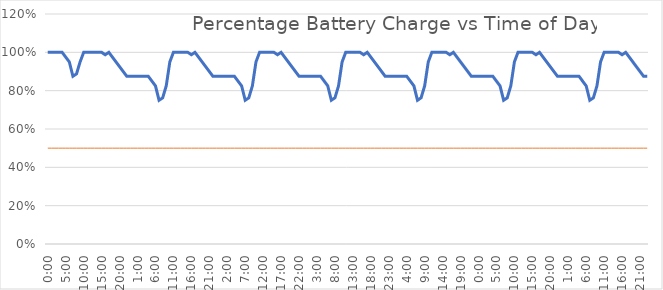
| Category | Charge % | Discharge Limit |
|---|---|---|
| 0.0 | 1 | 0.5 |
| 0.041666666666666664 | 1 | 0.5 |
| 0.08333333333333333 | 1 | 0.5 |
| 0.125 | 1 | 0.5 |
| 0.166666666666667 | 1 | 0.5 |
| 0.208333333333333 | 0.975 | 0.5 |
| 0.25 | 0.95 | 0.5 |
| 0.291666666666667 | 0.875 | 0.5 |
| 0.333333333333333 | 0.888 | 0.5 |
| 0.375 | 0.95 | 0.5 |
| 0.416666666666667 | 1 | 0.5 |
| 0.458333333333333 | 1 | 0.5 |
| 0.5 | 1 | 0.5 |
| 0.541666666666667 | 1 | 0.5 |
| 0.583333333333333 | 1 | 0.5 |
| 0.625 | 1 | 0.5 |
| 0.666666666666667 | 0.988 | 0.5 |
| 0.708333333333333 | 1 | 0.5 |
| 0.75 | 0.975 | 0.5 |
| 0.791666666666667 | 0.95 | 0.5 |
| 0.833333333333333 | 0.925 | 0.5 |
| 0.875 | 0.9 | 0.5 |
| 0.916666666666667 | 0.875 | 0.5 |
| 0.958333333333333 | 0.875 | 0.5 |
| 0.0 | 0.875 | 0.5 |
| 0.041666666666666664 | 0.875 | 0.5 |
| 0.08333333333333333 | 0.875 | 0.5 |
| 0.125 | 0.875 | 0.5 |
| 0.166666666666667 | 0.875 | 0.5 |
| 0.208333333333333 | 0.85 | 0.5 |
| 0.25 | 0.825 | 0.5 |
| 0.291666666666667 | 0.75 | 0.5 |
| 0.333333333333333 | 0.762 | 0.5 |
| 0.375 | 0.825 | 0.5 |
| 0.416666666666667 | 0.95 | 0.5 |
| 0.458333333333333 | 1 | 0.5 |
| 0.5 | 1 | 0.5 |
| 0.541666666666667 | 1 | 0.5 |
| 0.583333333333333 | 1 | 0.5 |
| 0.625 | 1 | 0.5 |
| 0.666666666666667 | 0.988 | 0.5 |
| 0.708333333333333 | 1 | 0.5 |
| 0.75 | 0.975 | 0.5 |
| 0.791666666666667 | 0.95 | 0.5 |
| 0.833333333333333 | 0.925 | 0.5 |
| 0.875 | 0.9 | 0.5 |
| 0.916666666666667 | 0.875 | 0.5 |
| 0.958333333333333 | 0.875 | 0.5 |
| 0.0 | 0.875 | 0.5 |
| 0.041666666666666664 | 0.875 | 0.5 |
| 0.08333333333333333 | 0.875 | 0.5 |
| 0.125 | 0.875 | 0.5 |
| 0.166666666666667 | 0.875 | 0.5 |
| 0.208333333333333 | 0.85 | 0.5 |
| 0.25 | 0.825 | 0.5 |
| 0.291666666666667 | 0.75 | 0.5 |
| 0.333333333333333 | 0.762 | 0.5 |
| 0.375 | 0.825 | 0.5 |
| 0.416666666666667 | 0.95 | 0.5 |
| 0.458333333333333 | 1 | 0.5 |
| 0.5 | 1 | 0.5 |
| 0.541666666666667 | 1 | 0.5 |
| 0.583333333333333 | 1 | 0.5 |
| 0.625 | 1 | 0.5 |
| 0.666666666666667 | 0.988 | 0.5 |
| 0.708333333333333 | 1 | 0.5 |
| 0.75 | 0.975 | 0.5 |
| 0.791666666666667 | 0.95 | 0.5 |
| 0.833333333333333 | 0.925 | 0.5 |
| 0.875 | 0.9 | 0.5 |
| 0.916666666666667 | 0.875 | 0.5 |
| 0.958333333333333 | 0.875 | 0.5 |
| 0.0 | 0.875 | 0.5 |
| 0.041666666666666664 | 0.875 | 0.5 |
| 0.08333333333333333 | 0.875 | 0.5 |
| 0.125 | 0.875 | 0.5 |
| 0.166666666666667 | 0.875 | 0.5 |
| 0.208333333333333 | 0.85 | 0.5 |
| 0.25 | 0.825 | 0.5 |
| 0.291666666666667 | 0.75 | 0.5 |
| 0.333333333333333 | 0.762 | 0.5 |
| 0.375 | 0.825 | 0.5 |
| 0.416666666666667 | 0.95 | 0.5 |
| 0.458333333333333 | 1 | 0.5 |
| 0.5 | 1 | 0.5 |
| 0.541666666666667 | 1 | 0.5 |
| 0.583333333333333 | 1 | 0.5 |
| 0.625 | 1 | 0.5 |
| 0.666666666666667 | 0.988 | 0.5 |
| 0.708333333333333 | 1 | 0.5 |
| 0.75 | 0.975 | 0.5 |
| 0.791666666666667 | 0.95 | 0.5 |
| 0.833333333333333 | 0.925 | 0.5 |
| 0.875 | 0.9 | 0.5 |
| 0.916666666666667 | 0.875 | 0.5 |
| 0.958333333333333 | 0.875 | 0.5 |
| 0.0 | 0.875 | 0.5 |
| 0.041666666666666664 | 0.875 | 0.5 |
| 0.08333333333333333 | 0.875 | 0.5 |
| 0.125 | 0.875 | 0.5 |
| 0.166666666666667 | 0.875 | 0.5 |
| 0.208333333333333 | 0.85 | 0.5 |
| 0.25 | 0.825 | 0.5 |
| 0.291666666666667 | 0.75 | 0.5 |
| 0.333333333333333 | 0.762 | 0.5 |
| 0.375 | 0.825 | 0.5 |
| 0.416666666666667 | 0.95 | 0.5 |
| 0.458333333333333 | 1 | 0.5 |
| 0.5 | 1 | 0.5 |
| 0.541666666666667 | 1 | 0.5 |
| 0.583333333333333 | 1 | 0.5 |
| 0.625 | 1 | 0.5 |
| 0.666666666666667 | 0.988 | 0.5 |
| 0.708333333333333 | 1 | 0.5 |
| 0.75 | 0.975 | 0.5 |
| 0.791666666666667 | 0.95 | 0.5 |
| 0.833333333333333 | 0.925 | 0.5 |
| 0.875 | 0.9 | 0.5 |
| 0.916666666666667 | 0.875 | 0.5 |
| 0.958333333333333 | 0.875 | 0.5 |
| 0.0 | 0.875 | 0.5 |
| 0.041666666666666664 | 0.875 | 0.5 |
| 0.08333333333333333 | 0.875 | 0.5 |
| 0.125 | 0.875 | 0.5 |
| 0.166666666666667 | 0.875 | 0.5 |
| 0.208333333333333 | 0.85 | 0.5 |
| 0.25 | 0.825 | 0.5 |
| 0.291666666666667 | 0.75 | 0.5 |
| 0.333333333333333 | 0.762 | 0.5 |
| 0.375 | 0.825 | 0.5 |
| 0.416666666666667 | 0.95 | 0.5 |
| 0.458333333333333 | 1 | 0.5 |
| 0.5 | 1 | 0.5 |
| 0.541666666666667 | 1 | 0.5 |
| 0.583333333333333 | 1 | 0.5 |
| 0.625 | 1 | 0.5 |
| 0.666666666666667 | 0.988 | 0.5 |
| 0.708333333333333 | 1 | 0.5 |
| 0.75 | 0.975 | 0.5 |
| 0.791666666666667 | 0.95 | 0.5 |
| 0.833333333333333 | 0.925 | 0.5 |
| 0.875 | 0.9 | 0.5 |
| 0.916666666666667 | 0.875 | 0.5 |
| 0.958333333333333 | 0.875 | 0.5 |
| 0.0 | 0.875 | 0.5 |
| 0.041666666666666664 | 0.875 | 0.5 |
| 0.08333333333333333 | 0.875 | 0.5 |
| 0.125 | 0.875 | 0.5 |
| 0.166666666666667 | 0.875 | 0.5 |
| 0.208333333333333 | 0.85 | 0.5 |
| 0.25 | 0.825 | 0.5 |
| 0.291666666666667 | 0.75 | 0.5 |
| 0.333333333333333 | 0.762 | 0.5 |
| 0.375 | 0.825 | 0.5 |
| 0.416666666666667 | 0.95 | 0.5 |
| 0.458333333333333 | 1 | 0.5 |
| 0.5 | 1 | 0.5 |
| 0.541666666666667 | 1 | 0.5 |
| 0.583333333333333 | 1 | 0.5 |
| 0.625 | 1 | 0.5 |
| 0.666666666666667 | 0.988 | 0.5 |
| 0.708333333333333 | 1 | 0.5 |
| 0.75 | 0.975 | 0.5 |
| 0.791666666666667 | 0.95 | 0.5 |
| 0.833333333333333 | 0.925 | 0.5 |
| 0.875 | 0.9 | 0.5 |
| 0.916666666666667 | 0.875 | 0.5 |
| 0.958333333333333 | 0.875 | 0.5 |